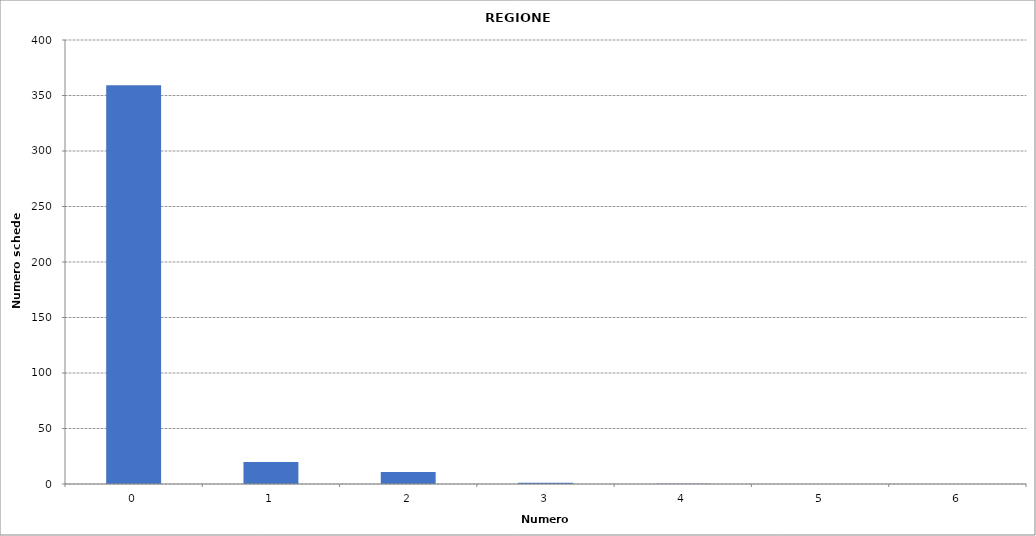
| Category | Series 0 |
|---|---|
| 0.0 | 359259 |
| 1.0 | 19849 |
| 2.0 | 10850 |
| 3.0 | 1139 |
| 4.0 | 183 |
| 5.0 | 35 |
| 6.0 | 6 |